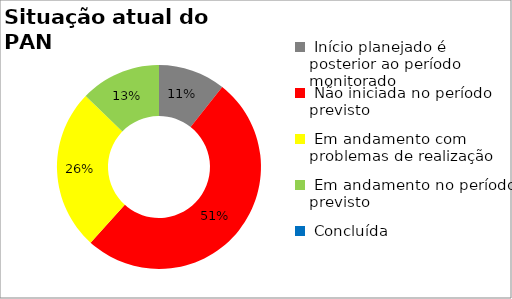
| Category | Series 0 |
|---|---|
|  Início planejado é posterior ao período monitorado | 0.106 |
|  Não iniciada no período previsto | 0.511 |
|  Em andamento com problemas de realização | 0.255 |
|  Em andamento no período previsto  | 0.128 |
|  Concluída | 0 |